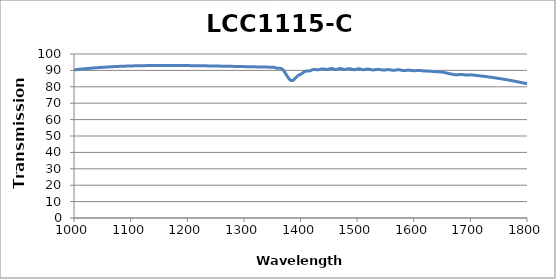
| Category | LCC1115-C Transmission |
|---|---|
| 1000.0 | 90.286 |
| 1002.0 | 90.368 |
| 1004.0 | 90.448 |
| 1006.0 | 90.526 |
| 1008.0 | 90.603 |
| 1010.0 | 90.678 |
| 1012.0 | 90.752 |
| 1014.0 | 90.824 |
| 1016.0 | 90.894 |
| 1018.0 | 90.964 |
| 1020.0 | 91.031 |
| 1022.0 | 91.097 |
| 1024.0 | 91.162 |
| 1026.0 | 91.225 |
| 1028.0 | 91.287 |
| 1030.0 | 91.347 |
| 1032.0 | 91.407 |
| 1034.0 | 91.464 |
| 1036.0 | 91.521 |
| 1038.0 | 91.576 |
| 1040.0 | 91.629 |
| 1042.0 | 91.682 |
| 1044.0 | 91.733 |
| 1046.0 | 91.783 |
| 1048.0 | 91.831 |
| 1050.0 | 91.879 |
| 1052.0 | 91.925 |
| 1054.0 | 91.97 |
| 1056.0 | 92.014 |
| 1058.0 | 92.056 |
| 1060.0 | 92.098 |
| 1062.0 | 92.138 |
| 1064.0 | 92.177 |
| 1066.0 | 92.215 |
| 1068.0 | 92.252 |
| 1070.0 | 92.288 |
| 1072.0 | 92.323 |
| 1074.0 | 92.357 |
| 1076.0 | 92.39 |
| 1078.0 | 92.421 |
| 1080.0 | 92.452 |
| 1082.0 | 92.482 |
| 1084.0 | 92.51 |
| 1086.0 | 92.538 |
| 1088.0 | 92.565 |
| 1090.0 | 92.591 |
| 1092.0 | 92.616 |
| 1094.0 | 92.64 |
| 1096.0 | 92.663 |
| 1098.0 | 92.685 |
| 1100.0 | 92.707 |
| 1102.0 | 92.727 |
| 1104.0 | 92.747 |
| 1106.0 | 92.766 |
| 1108.0 | 92.784 |
| 1110.0 | 92.801 |
| 1112.0 | 92.817 |
| 1114.0 | 92.833 |
| 1116.0 | 92.848 |
| 1118.0 | 92.862 |
| 1120.0 | 92.875 |
| 1122.0 | 92.888 |
| 1124.0 | 92.9 |
| 1126.0 | 92.911 |
| 1128.0 | 92.922 |
| 1130.0 | 92.932 |
| 1132.0 | 92.941 |
| 1134.0 | 92.949 |
| 1136.0 | 92.957 |
| 1138.0 | 92.964 |
| 1140.0 | 92.971 |
| 1142.0 | 92.977 |
| 1144.0 | 92.982 |
| 1146.0 | 92.987 |
| 1148.0 | 92.991 |
| 1150.0 | 92.995 |
| 1152.0 | 92.998 |
| 1154.0 | 93.001 |
| 1156.0 | 93.003 |
| 1158.0 | 93.004 |
| 1160.0 | 93.005 |
| 1162.0 | 93.006 |
| 1164.0 | 93.006 |
| 1166.0 | 93.005 |
| 1168.0 | 93.004 |
| 1170.0 | 93.003 |
| 1172.0 | 93.001 |
| 1174.0 | 92.998 |
| 1176.0 | 92.996 |
| 1178.0 | 92.992 |
| 1180.0 | 92.989 |
| 1182.0 | 92.985 |
| 1184.0 | 92.98 |
| 1186.0 | 92.975 |
| 1188.0 | 92.97 |
| 1190.0 | 92.965 |
| 1192.0 | 92.959 |
| 1194.0 | 92.952 |
| 1196.0 | 92.946 |
| 1198.0 | 92.939 |
| 1200.0 | 92.931 |
| 1202.0 | 92.924 |
| 1204.0 | 92.916 |
| 1206.0 | 92.908 |
| 1208.0 | 92.899 |
| 1210.0 | 92.89 |
| 1212.0 | 92.881 |
| 1214.0 | 92.872 |
| 1216.0 | 92.862 |
| 1218.0 | 92.852 |
| 1220.0 | 92.842 |
| 1222.0 | 92.832 |
| 1224.0 | 92.821 |
| 1226.0 | 92.811 |
| 1228.0 | 92.8 |
| 1230.0 | 92.788 |
| 1232.0 | 92.777 |
| 1234.0 | 92.765 |
| 1236.0 | 92.754 |
| 1238.0 | 92.742 |
| 1240.0 | 92.729 |
| 1242.0 | 92.717 |
| 1244.0 | 92.704 |
| 1246.0 | 92.692 |
| 1248.0 | 92.679 |
| 1250.0 | 92.666 |
| 1252.0 | 92.653 |
| 1254.0 | 92.64 |
| 1256.0 | 92.626 |
| 1258.0 | 92.613 |
| 1260.0 | 92.599 |
| 1262.0 | 92.586 |
| 1264.0 | 92.572 |
| 1266.0 | 92.558 |
| 1268.0 | 92.544 |
| 1270.0 | 92.53 |
| 1272.0 | 92.516 |
| 1274.0 | 92.502 |
| 1276.0 | 92.487 |
| 1278.0 | 92.473 |
| 1280.0 | 92.458 |
| 1282.0 | 92.444 |
| 1284.0 | 92.429 |
| 1286.0 | 92.415 |
| 1288.0 | 92.4 |
| 1290.0 | 92.385 |
| 1292.0 | 92.371 |
| 1294.0 | 92.356 |
| 1296.0 | 92.341 |
| 1298.0 | 92.326 |
| 1300.0 | 92.312 |
| 1302.0 | 92.297 |
| 1304.0 | 92.282 |
| 1306.0 | 92.267 |
| 1308.0 | 92.252 |
| 1310.0 | 92.237 |
| 1312.0 | 92.223 |
| 1314.0 | 92.208 |
| 1316.0 | 92.193 |
| 1318.0 | 92.178 |
| 1320.0 | 92.163 |
| 1322.0 | 92.148 |
| 1324.0 | 92.134 |
| 1326.0 | 92.119 |
| 1328.0 | 92.104 |
| 1330.0 | 92.089 |
| 1332.0 | 92.075 |
| 1334.0 | 92.06 |
| 1336.0 | 92.045 |
| 1338.0 | 92.031 |
| 1340.0 | 92.016 |
| 1342.0 | 92.002 |
| 1344.0 | 91.987 |
| 1346.0 | 91.973 |
| 1348.0 | 91.958 |
| 1350.0 | 91.958 |
| 1352.0 | 91.959 |
| 1354.0 | 91.801 |
| 1356.0 | 91.569 |
| 1358.0 | 91.383 |
| 1360.0 | 91.294 |
| 1362.0 | 91.3 |
| 1364.0 | 91.289 |
| 1366.0 | 91.135 |
| 1368.0 | 90.718 |
| 1370.0 | 89.976 |
| 1372.0 | 88.974 |
| 1374.0 | 87.877 |
| 1376.0 | 86.783 |
| 1378.0 | 85.733 |
| 1380.0 | 84.808 |
| 1382.0 | 84.139 |
| 1384.0 | 83.809 |
| 1386.0 | 83.834 |
| 1388.0 | 84.245 |
| 1390.0 | 84.928 |
| 1392.0 | 85.696 |
| 1394.0 | 86.4 |
| 1396.0 | 86.902 |
| 1398.0 | 87.257 |
| 1400.0 | 87.584 |
| 1402.0 | 87.994 |
| 1404.0 | 88.509 |
| 1406.0 | 89.012 |
| 1408.0 | 89.392 |
| 1410.0 | 89.555 |
| 1412.0 | 89.566 |
| 1414.0 | 89.567 |
| 1416.0 | 89.675 |
| 1418.0 | 89.914 |
| 1420.0 | 90.219 |
| 1422.0 | 90.478 |
| 1424.0 | 90.587 |
| 1426.0 | 90.531 |
| 1428.0 | 90.407 |
| 1430.0 | 90.331 |
| 1432.0 | 90.371 |
| 1434.0 | 90.543 |
| 1436.0 | 90.75 |
| 1438.0 | 90.896 |
| 1440.0 | 90.909 |
| 1442.0 | 90.803 |
| 1444.0 | 90.65 |
| 1446.0 | 90.566 |
| 1448.0 | 90.614 |
| 1450.0 | 90.788 |
| 1452.0 | 90.999 |
| 1454.0 | 91.123 |
| 1456.0 | 91.091 |
| 1458.0 | 90.923 |
| 1460.0 | 90.711 |
| 1462.0 | 90.577 |
| 1464.0 | 90.62 |
| 1466.0 | 90.799 |
| 1468.0 | 91.005 |
| 1470.0 | 91.114 |
| 1472.0 | 91.057 |
| 1474.0 | 90.87 |
| 1476.0 | 90.662 |
| 1478.0 | 90.56 |
| 1480.0 | 90.622 |
| 1482.0 | 90.8 |
| 1484.0 | 90.986 |
| 1486.0 | 91.077 |
| 1488.0 | 91.016 |
| 1490.0 | 90.824 |
| 1492.0 | 90.588 |
| 1494.0 | 90.443 |
| 1496.0 | 90.475 |
| 1498.0 | 90.635 |
| 1500.0 | 90.826 |
| 1502.0 | 90.939 |
| 1504.0 | 90.923 |
| 1506.0 | 90.781 |
| 1508.0 | 90.582 |
| 1510.0 | 90.439 |
| 1512.0 | 90.435 |
| 1514.0 | 90.526 |
| 1516.0 | 90.675 |
| 1518.0 | 90.789 |
| 1520.0 | 90.779 |
| 1522.0 | 90.667 |
| 1524.0 | 90.507 |
| 1526.0 | 90.358 |
| 1528.0 | 90.283 |
| 1530.0 | 90.316 |
| 1532.0 | 90.426 |
| 1534.0 | 90.554 |
| 1536.0 | 90.637 |
| 1538.0 | 90.633 |
| 1540.0 | 90.55 |
| 1542.0 | 90.408 |
| 1544.0 | 90.279 |
| 1546.0 | 90.205 |
| 1548.0 | 90.225 |
| 1550.0 | 90.299 |
| 1552.0 | 90.41 |
| 1554.0 | 90.48 |
| 1556.0 | 90.461 |
| 1558.0 | 90.368 |
| 1560.0 | 90.219 |
| 1562.0 | 90.09 |
| 1564.0 | 90.048 |
| 1566.0 | 90.08 |
| 1568.0 | 90.189 |
| 1570.0 | 90.31 |
| 1572.0 | 90.383 |
| 1574.0 | 90.368 |
| 1576.0 | 90.256 |
| 1578.0 | 90.117 |
| 1580.0 | 89.983 |
| 1582.0 | 89.913 |
| 1584.0 | 89.93 |
| 1586.0 | 90.002 |
| 1588.0 | 90.095 |
| 1590.0 | 90.163 |
| 1592.0 | 90.146 |
| 1594.0 | 90.054 |
| 1596.0 | 89.959 |
| 1598.0 | 89.874 |
| 1600.0 | 89.823 |
| 1602.0 | 89.841 |
| 1604.0 | 89.886 |
| 1606.0 | 89.938 |
| 1608.0 | 89.952 |
| 1610.0 | 89.943 |
| 1612.0 | 89.897 |
| 1614.0 | 89.804 |
| 1616.0 | 89.723 |
| 1618.0 | 89.653 |
| 1620.0 | 89.602 |
| 1622.0 | 89.574 |
| 1624.0 | 89.559 |
| 1626.0 | 89.55 |
| 1628.0 | 89.525 |
| 1630.0 | 89.489 |
| 1632.0 | 89.422 |
| 1634.0 | 89.346 |
| 1636.0 | 89.272 |
| 1638.0 | 89.218 |
| 1640.0 | 89.183 |
| 1642.0 | 89.146 |
| 1644.0 | 89.12 |
| 1646.0 | 89.092 |
| 1648.0 | 89.04 |
| 1650.0 | 88.943 |
| 1652.0 | 88.854 |
| 1654.0 | 88.748 |
| 1656.0 | 88.586 |
| 1658.0 | 88.409 |
| 1660.0 | 88.215 |
| 1662.0 | 88.041 |
| 1664.0 | 87.906 |
| 1666.0 | 87.804 |
| 1668.0 | 87.698 |
| 1670.0 | 87.515 |
| 1672.0 | 87.415 |
| 1674.0 | 87.348 |
| 1676.0 | 87.331 |
| 1678.0 | 87.358 |
| 1680.0 | 87.423 |
| 1682.0 | 87.471 |
| 1684.0 | 87.486 |
| 1686.0 | 87.45 |
| 1688.0 | 87.363 |
| 1690.0 | 87.274 |
| 1692.0 | 87.194 |
| 1694.0 | 87.134 |
| 1696.0 | 87.143 |
| 1698.0 | 87.202 |
| 1700.0 | 87.281 |
| 1702.0 | 87.281 |
| 1704.0 | 87.206 |
| 1706.0 | 87.13 |
| 1708.0 | 87.053 |
| 1710.0 | 86.974 |
| 1712.0 | 86.894 |
| 1714.0 | 86.813 |
| 1716.0 | 86.731 |
| 1718.0 | 86.647 |
| 1720.0 | 86.562 |
| 1722.0 | 86.476 |
| 1724.0 | 86.388 |
| 1726.0 | 86.299 |
| 1728.0 | 86.208 |
| 1730.0 | 86.116 |
| 1732.0 | 86.022 |
| 1734.0 | 85.928 |
| 1736.0 | 85.831 |
| 1738.0 | 85.733 |
| 1740.0 | 85.634 |
| 1742.0 | 85.533 |
| 1744.0 | 85.43 |
| 1746.0 | 85.326 |
| 1748.0 | 85.221 |
| 1750.0 | 85.113 |
| 1752.0 | 85.004 |
| 1754.0 | 84.894 |
| 1756.0 | 84.782 |
| 1758.0 | 84.668 |
| 1760.0 | 84.552 |
| 1762.0 | 84.435 |
| 1764.0 | 84.316 |
| 1766.0 | 84.195 |
| 1768.0 | 84.073 |
| 1770.0 | 83.949 |
| 1772.0 | 83.822 |
| 1774.0 | 83.695 |
| 1776.0 | 83.565 |
| 1778.0 | 83.433 |
| 1780.0 | 83.3 |
| 1782.0 | 83.164 |
| 1784.0 | 83.027 |
| 1786.0 | 82.888 |
| 1788.0 | 82.747 |
| 1790.0 | 82.604 |
| 1792.0 | 82.458 |
| 1794.0 | 82.311 |
| 1796.0 | 82.162 |
| 1798.0 | 82.011 |
| 1800.0 | 81.857 |